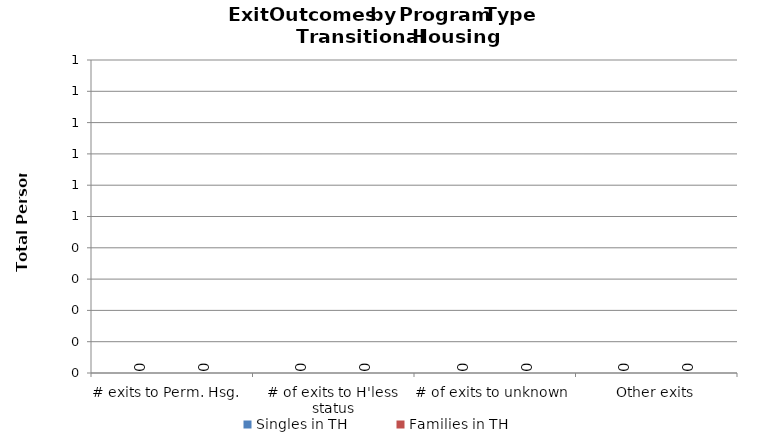
| Category | Singles in TH | Families in TH |
|---|---|---|
| # exits to Perm. Hsg.   | 0 | 0 |
| # of exits to H'less status | 0 | 0 |
| # of exits to unknown | 0 | 0 |
| Other exits | 0 | 0 |